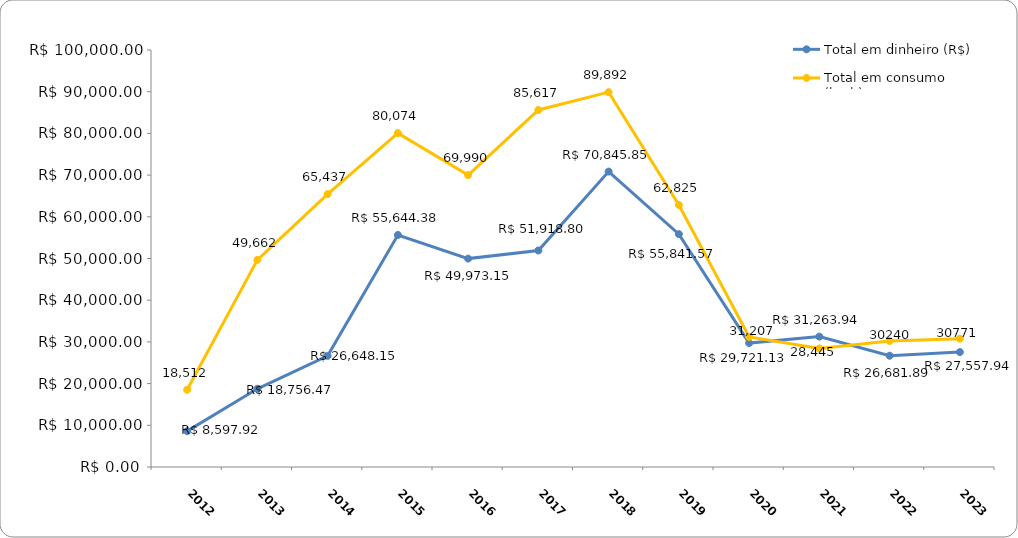
| Category | Total em dinheiro (R$) | Total em consumo (kWh) |
|---|---|---|
| 2012.0 | 8597.92 | 18512 |
| 2013.0 | 18756.47 | 49662 |
| 2014.0 | 26648.15 | 65437 |
| 2015.0 | 55644.38 | 80074 |
| 2016.0 | 49973.15 | 69990 |
| 2017.0 | 51918.8 | 85617 |
| 2018.0 | 70845.85 | 89892 |
| 2019.0 | 55841.57 | 62825 |
| 2020.0 | 29721.13 | 31207 |
| 2021.0 | 31263.94 | 28445 |
| 2022.0 | 26681.89 | 30240 |
| 2023.0 | 27557.94 | 30771 |